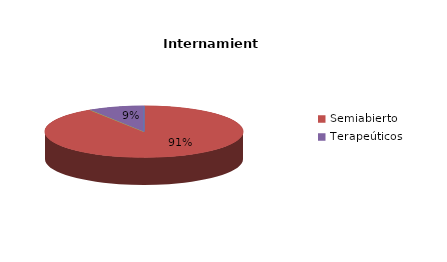
| Category | Series 0 |
|---|---|
| Cerrado | 0 |
| Semiabierto | 10 |
| Abierto | 0 |
| Terapeúticos | 1 |